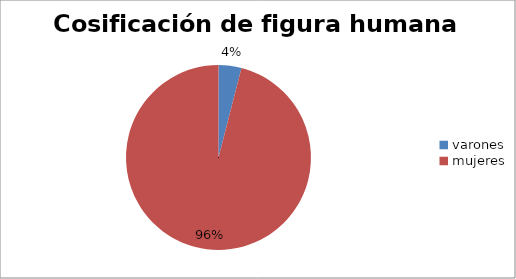
| Category | cosificación |
|---|---|
| varones | 24 |
| mujeres | 576 |